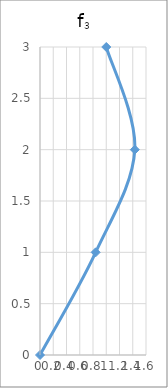
| Category | f3 |
|---|---|
| 0.0 | 0 |
| 0.8400155361318169 | 1 |
| 1.4311646507090727 | 2 |
| 1.0 | 3 |